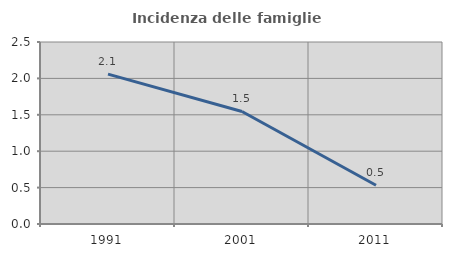
| Category | Incidenza delle famiglie numerose |
|---|---|
| 1991.0 | 2.059 |
| 2001.0 | 1.546 |
| 2011.0 | 0.532 |